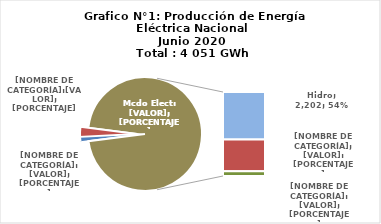
| Category | Series 0 |
|---|---|
| 0 | 48.774 |
| 1 | 113.265 |
| 2 | 2201.795 |
| 3 | 1470.084 |
| 4 | 217.057 |